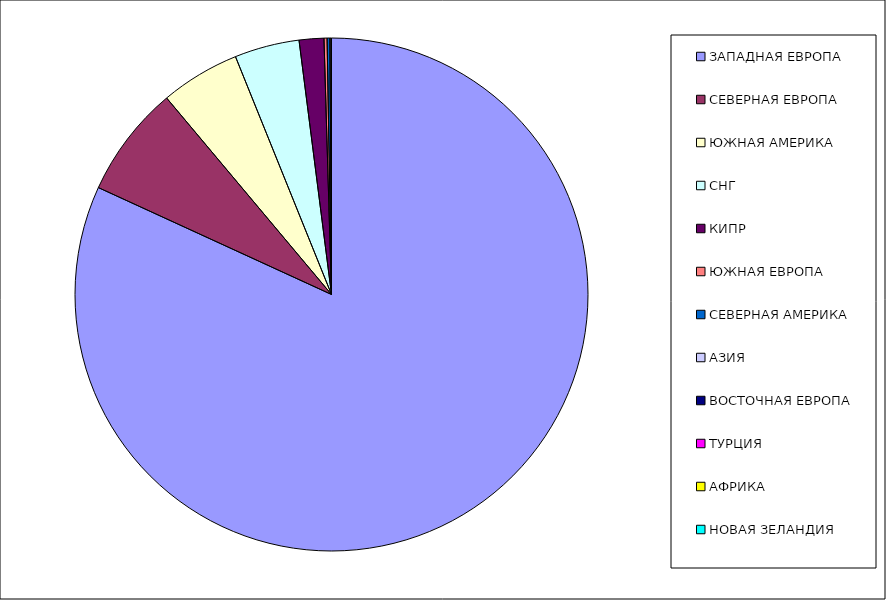
| Category | Оборот |
|---|---|
| ЗАПАДНАЯ ЕВРОПА | 0.818 |
| СЕВЕРНАЯ ЕВРОПА | 0.07 |
| ЮЖНАЯ АМЕРИКА | 0.05 |
| СНГ | 0.041 |
| КИПР | 0.016 |
| ЮЖНАЯ ЕВРОПА | 0.002 |
| СЕВЕРНАЯ АМЕРИКА | 0.002 |
| АЗИЯ | 0.001 |
| ВОСТОЧНАЯ ЕВРОПА | 0 |
| ТУРЦИЯ | 0 |
| АФРИКА | 0 |
| НОВАЯ ЗЕЛАНДИЯ | 0 |